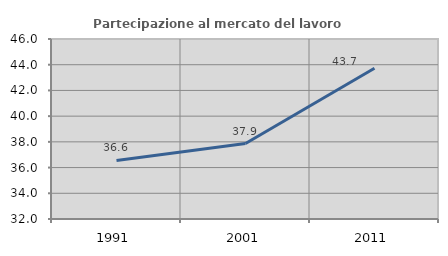
| Category | Partecipazione al mercato del lavoro  femminile |
|---|---|
| 1991.0 | 36.554 |
| 2001.0 | 37.871 |
| 2011.0 | 43.728 |